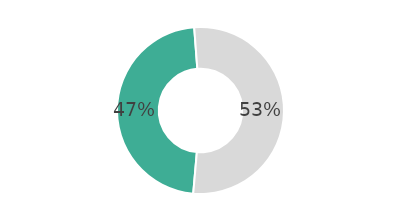
| Category | Series 0 |
|---|---|
| Oui | 47.406 |
| Non | 52.594 |